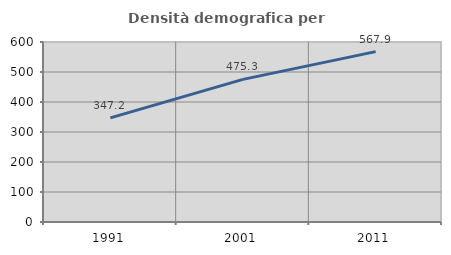
| Category | Densità demografica |
|---|---|
| 1991.0 | 347.239 |
| 2001.0 | 475.344 |
| 2011.0 | 567.88 |